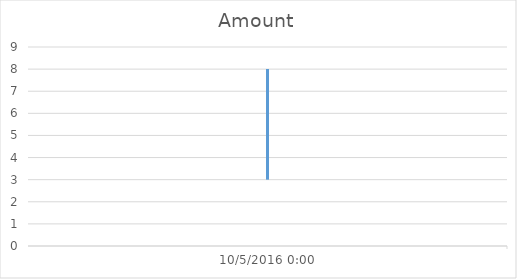
| Category | Amount |
|---|---|
| 10/5/16 | 7 |
| 10/5/16 | 4 |
| 10/5/16 | 8 |
| 10/5/16 | 8 |
| 10/5/16 | 4 |
| 10/5/16 | 3 |